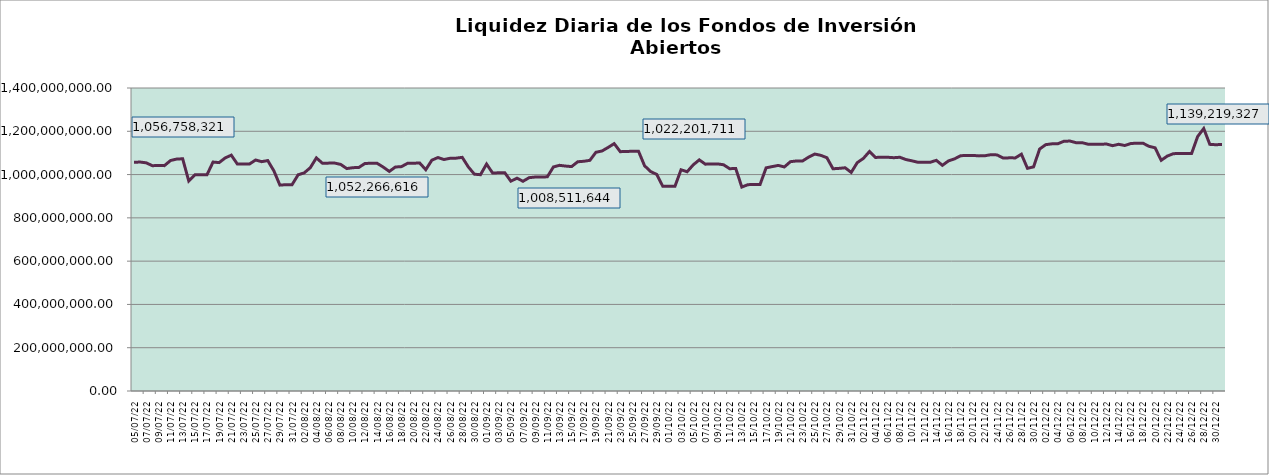
| Category | Series 0 |
|---|---|
| 2022-07-05 | 1056758321.45 |
| 2022-07-06 | 1057902779.38 |
| 2022-07-07 | 1054247867.17 |
| 2022-07-08 | 1041275501.24 |
| 2022-07-09 | 1041442085.98 |
| 2022-07-10 | 1041320133.99 |
| 2022-07-11 | 1064861578.1 |
| 2022-07-12 | 1071610212.79 |
| 2022-07-13 | 1073003415.6 |
| 2022-07-14 | 970728053.9 |
| 2022-07-15 | 998646404.63 |
| 2022-07-16 | 999120338.23 |
| 2022-07-17 | 998989766.26 |
| 2022-07-18 | 1057821270.15 |
| 2022-07-19 | 1055296548.63 |
| 2022-07-20 | 1076929811.31 |
| 2022-07-21 | 1089683087.42 |
| 2022-07-22 | 1048537216.35 |
| 2022-07-23 | 1049045695.18 |
| 2022-07-24 | 1048908121.96 |
| 2022-07-25 | 1067343693.11 |
| 2022-07-26 | 1059660648.64 |
| 2022-07-27 | 1064700190.56 |
| 2022-07-28 | 1017695969.55 |
| 2022-07-29 | 951274574.52 |
| 2022-07-30 | 953328706.51 |
| 2022-07-31 | 953240496.98 |
| 2022-08-01 | 999036062.31 |
| 2022-08-02 | 1007829132.2 |
| 2022-08-03 | 1031756344.54 |
| 2022-08-04 | 1077079395.17 |
| 2022-08-05 | 1052266615.6 |
| 2022-08-06 | 1052872182.16 |
| 2022-08-07 | 1053235302.98 |
| 2022-08-08 | 1046907687.11 |
| 2022-08-09 | 1027733236.36 |
| 2022-08-10 | 1031764856.72 |
| 2022-08-11 | 1033117692.03 |
| 2022-08-12 | 1051403819.1 |
| 2022-08-13 | 1052094416.18 |
| 2022-08-14 | 1051951619.49 |
| 2022-08-15 | 1034609643.93 |
| 2022-08-16 | 1014535570.54 |
| 2022-08-17 | 1034938308.83 |
| 2022-08-18 | 1036740415.69 |
| 2022-08-19 | 1051920096.51 |
| 2022-08-20 | 1052594999.52 |
| 2022-08-21 | 1053327890.5 |
| 2022-08-22 | 1022571409.51 |
| 2022-08-23 | 1066470834 |
| 2022-08-24 | 1078742351.32 |
| 2022-08-25 | 1069621132.88 |
| 2022-08-26 | 1075318480.17 |
| 2022-08-27 | 1075899547.35 |
| 2022-08-28 | 1079573755.61 |
| 2022-08-29 | 1035415343.46 |
| 2022-08-30 | 1001721444.06 |
| 2022-08-31 | 999386024.35 |
| 2022-09-01 | 1048518697.07 |
| 2022-09-02 | 1007091206.17 |
| 2022-09-03 | 1008196522.76 |
| 2022-09-04 | 1008511643.61 |
| 2022-09-05 | 969403342.99 |
| 2022-09-06 | 983305305.73 |
| 2022-09-07 | 969006925.6 |
| 2022-09-08 | 985667062.96 |
| 2022-09-09 | 988587942.41 |
| 2022-09-10 | 988847088.65 |
| 2022-09-11 | 989546332.98 |
| 2022-09-12 | 1035205925.98 |
| 2022-09-13 | 1042746715.61 |
| 2022-09-14 | 1039297165.41 |
| 2022-09-15 | 1036901014.69 |
| 2022-09-16 | 1059218636.95 |
| 2022-09-17 | 1061447153.49 |
| 2022-09-18 | 1065740365.66 |
| 2022-09-19 | 1103009684.6 |
| 2022-09-20 | 1109043067.16 |
| 2022-09-21 | 1125292560.44 |
| 2022-09-22 | 1142974207.15 |
| 2022-09-23 | 1105862620.92 |
| 2022-09-24 | 1106628504.36 |
| 2022-09-25 | 1107736011.46 |
| 2022-09-26 | 1107929560.02 |
| 2022-09-27 | 1040708220.37 |
| 2022-09-28 | 1013900587 |
| 2022-09-29 | 1000713014.2 |
| 2022-09-30 | 945695832.5 |
| 2022-10-01 | 945785472.42 |
| 2022-10-02 | 946054112.65 |
| 2022-10-03 | 1022201711.18 |
| 2022-10-04 | 1012932313.62 |
| 2022-10-05 | 1044794171.85 |
| 2022-10-06 | 1067890284.35 |
| 2022-10-07 | 1048099849.26 |
| 2022-10-08 | 1049225800.73 |
| 2022-10-09 | 1049325660.96 |
| 2022-10-10 | 1045289221.42 |
| 2022-10-11 | 1027130595.65 |
| 2022-10-12 | 1028229210.27 |
| 2022-10-13 | 942265816.9 |
| 2022-10-14 | 953309315.13 |
| 2022-10-15 | 954347829.03 |
| 2022-10-16 | 954205120.15 |
| 2022-10-17 | 1031141319.66 |
| 2022-10-18 | 1036907908.34 |
| 2022-10-19 | 1042330320.23 |
| 2022-10-20 | 1035198884.96 |
| 2022-10-21 | 1059645992.91 |
| 2022-10-22 | 1062813445 |
| 2022-10-23 | 1062956860.32 |
| 2022-10-24 | 1080727751.09 |
| 2022-10-25 | 1094929035.48 |
| 2022-10-26 | 1088820344.73 |
| 2022-10-27 | 1077775754.61 |
| 2022-10-28 | 1026827700.17 |
| 2022-10-29 | 1028635023.84 |
| 2022-10-30 | 1031365009.15 |
| 2022-10-31 | 1009952573.92 |
| 2022-11-01 | 1055286024.36 |
| 2022-11-02 | 1074711617.35 |
| 2022-11-03 | 1106453532.01 |
| 2022-11-04 | 1079145818.36 |
| 2022-11-05 | 1080143545.76 |
| 2022-11-06 | 1079983398.81 |
| 2022-11-07 | 1077971135.8 |
| 2022-11-08 | 1079949844.77 |
| 2022-11-09 | 1069458817 |
| 2022-11-10 | 1063445912.5 |
| 2022-11-11 | 1056641472.2 |
| 2022-11-12 | 1056604544.46 |
| 2022-11-13 | 1056755191.86 |
| 2022-11-14 | 1065766453.22 |
| 2022-11-15 | 1042687313.51 |
| 2022-11-16 | 1063189654.05 |
| 2022-11-17 | 1072469874.72 |
| 2022-11-18 | 1087248422.02 |
| 2022-11-19 | 1088154463.33 |
| 2022-11-20 | 1088659849.83 |
| 2022-11-21 | 1086331133.8 |
| 2022-11-22 | 1087040400.08 |
| 2022-11-23 | 1091871917.26 |
| 2022-11-24 | 1090839046.74 |
| 2022-11-25 | 1076472257.65 |
| 2022-11-26 | 1077243391.75 |
| 2022-11-27 | 1077077019.25 |
| 2022-11-28 | 1094131011.72 |
| 2022-11-29 | 1028843634.64 |
| 2022-11-30 | 1035551311.77 |
| 2022-12-01 | 1117952420.58 |
| 2022-12-02 | 1138227788.29 |
| 2022-12-03 | 1141921178.77 |
| 2022-12-04 | 1142446218.29 |
| 2022-12-05 | 1153906675.06 |
| 2022-12-06 | 1154808949.11 |
| 2022-12-07 | 1147228502.63 |
| 2022-12-08 | 1147215299.75 |
| 2022-12-09 | 1140143650.18 |
| 2022-12-10 | 1140047653.59 |
| 2022-12-11 | 1139886483 |
| 2022-12-12 | 1141222117.46 |
| 2022-12-13 | 1133508096.2 |
| 2022-12-14 | 1139908111.43 |
| 2022-12-15 | 1134250432.04 |
| 2022-12-16 | 1143579635.87 |
| 2022-12-17 | 1144848944.95 |
| 2022-12-18 | 1144946290.49 |
| 2022-12-19 | 1130581662.98 |
| 2022-12-20 | 1123640040.93 |
| 2022-12-21 | 1065847225.34 |
| 2022-12-22 | 1085396497.96 |
| 2022-12-23 | 1096598815.86 |
| 2022-12-24 | 1097296096.6 |
| 2022-12-25 | 1097143731.76 |
| 2022-12-26 | 1096999850.52 |
| 2022-12-27 | 1175801233 |
| 2022-12-28 | 1212604686.49 |
| 2022-12-29 | 1139603639.81 |
| 2022-12-30 | 1137897997.9 |
| 2022-12-31 | 1139219327.02 |